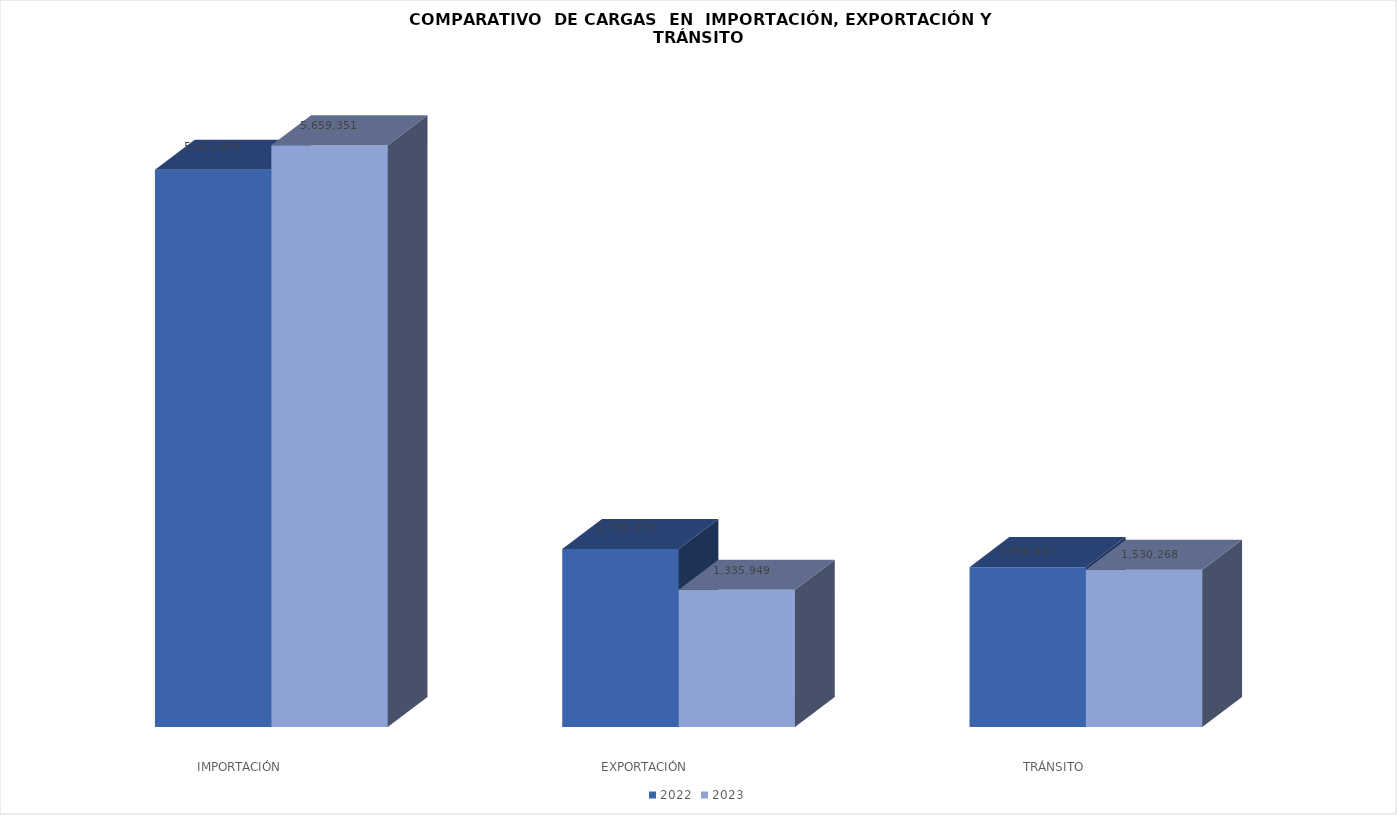
| Category | 2022 | 2023 |
|---|---|---|
| IMPORTACIÓN | 5421855.89 | 5659351 |
| EXPORTACIÓN  | 1731372.54 | 1335949 |
| TRÁNSITO | 1555647 | 1530268 |